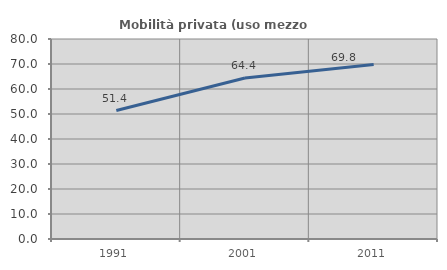
| Category | Mobilità privata (uso mezzo privato) |
|---|---|
| 1991.0 | 51.371 |
| 2001.0 | 64.426 |
| 2011.0 | 69.79 |